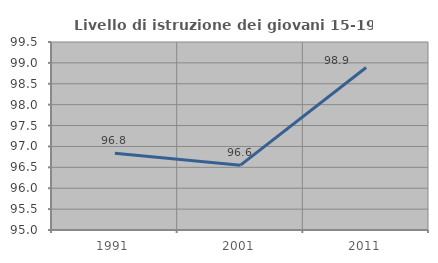
| Category | Livello di istruzione dei giovani 15-19 anni |
|---|---|
| 1991.0 | 96.835 |
| 2001.0 | 96.552 |
| 2011.0 | 98.889 |